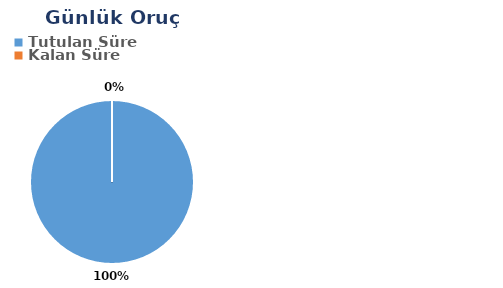
| Category | Günlük |
|---|---|
| Tutulan Süre | 0.585 |
| Kalan Süre | 0 |